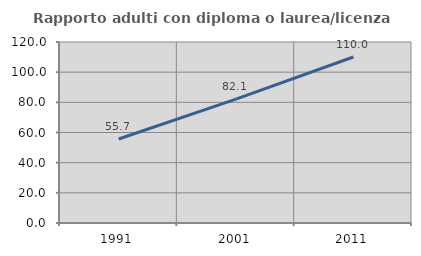
| Category | Rapporto adulti con diploma o laurea/licenza media  |
|---|---|
| 1991.0 | 55.67 |
| 2001.0 | 82.121 |
| 2011.0 | 110.041 |